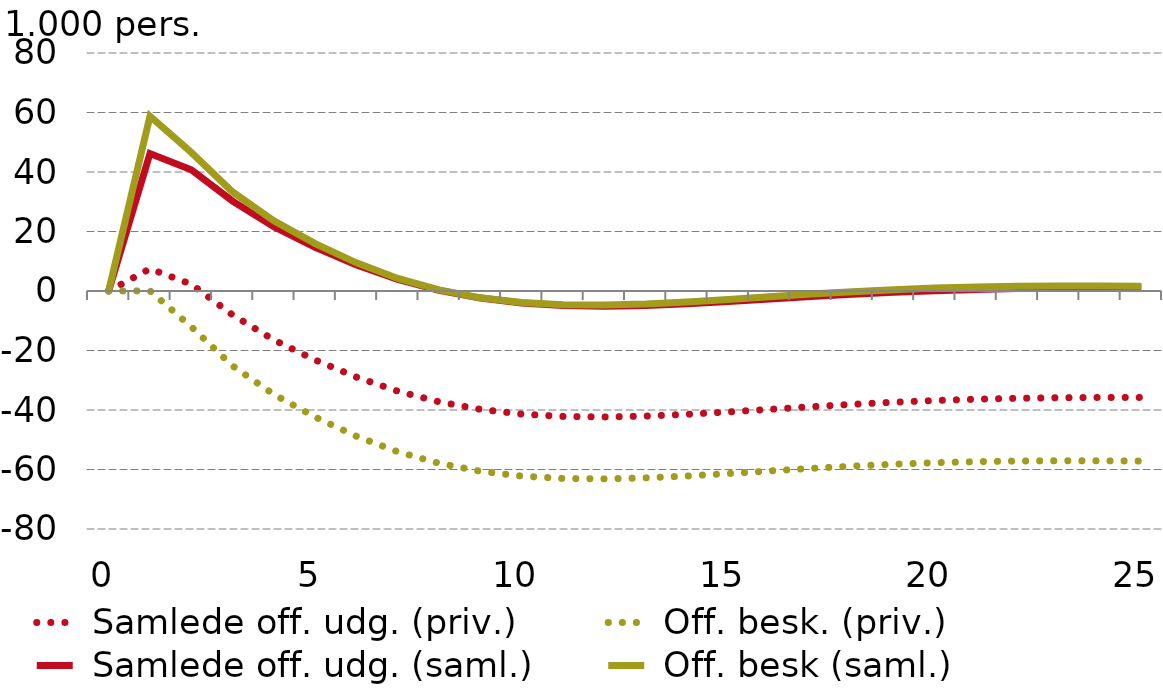
| Category |  Samlede off. udg. (priv.) |  Off. besk. (priv.) |  Samlede off. udg. (saml.) |  Off. besk (saml.) |
|---|---|---|---|---|
| 0.0 | 0 | 0 | 0 | 0 |
| nan | 7.463 | 0.042 | 46.199 | 58.774 |
| nan | 2.282 | -12.018 | 40.766 | 46.585 |
| nan | -8.041 | -25.18 | 30.214 | 33.3 |
| nan | -16.456 | -34.77 | 21.596 | 23.612 |
| 5.0 | -23.198 | -42.377 | 14.686 | 15.947 |
| nan | -28.95 | -48.836 | 8.787 | 9.454 |
| nan | -33.674 | -54.043 | 3.936 | 4.233 |
| nan | -37.272 | -57.926 | 0.23 | 0.354 |
| nan | -39.794 | -60.592 | -2.384 | -2.294 |
| 10.0 | -41.373 | -62.223 | -4.04 | -3.895 |
| nan | -42.167 | -63.014 | -4.9 | -4.648 |
| nan | -42.341 | -63.154 | -5.13 | -4.746 |
| nan | -42.052 | -62.822 | -4.889 | -4.371 |
| nan | -41.447 | -62.179 | -4.326 | -3.684 |
| 15.0 | -40.653 | -61.363 | -3.57 | -2.827 |
| nan | -39.777 | -60.485 | -2.729 | -1.911 |
| nan | -38.904 | -59.632 | -1.887 | -1.024 |
| nan | -38.094 | -58.864 | -1.106 | -0.226 |
| nan | -37.39 | -58.22 | -0.429 | 0.444 |
| 20.0 | -36.813 | -57.719 | 0.121 | 0.967 |
| nan | -36.371 | -57.366 | 0.538 | 1.339 |
| nan | -36.062 | -57.153 | 0.823 | 1.568 |
| nan | -35.873 | -57.064 | 0.989 | 1.671 |
| nan | -35.787 | -57.077 | 1.054 | 1.668 |
| 25.0 | -35.784 | -57.171 | 1.037 | 1.584 |